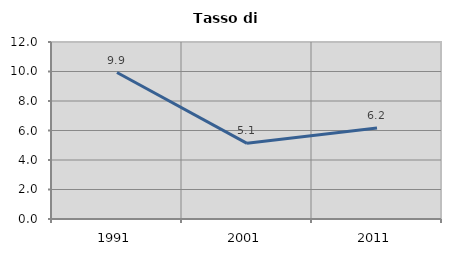
| Category | Tasso di disoccupazione   |
|---|---|
| 1991.0 | 9.93 |
| 2001.0 | 5.129 |
| 2011.0 | 6.171 |